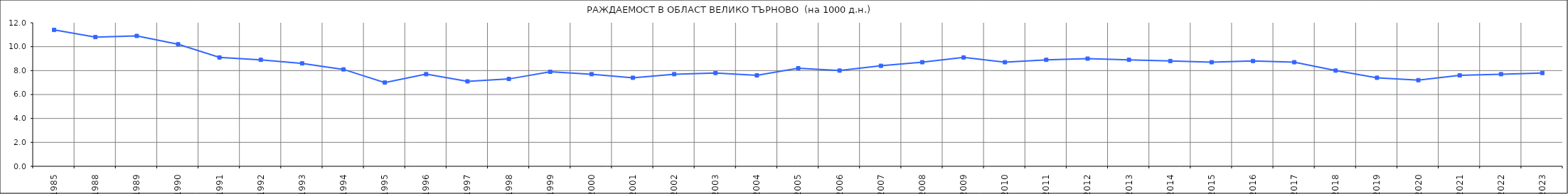
| Category | Series 0 | Series 1 |
|---|---|---|
| 1985.0 | 11.4 |  |
| 1988.0 | 10.8 |  |
| 1989.0 | 10.9 |  |
| 1990.0 | 10.2 |  |
| 1991.0 | 9.1 |  |
| 1992.0 | 8.9 |  |
| 1993.0 | 8.6 |  |
| 1994.0 | 8.1 |  |
| 1995.0 | 7 |  |
| 1996.0 | 7.7 |  |
| 1997.0 | 7.1 |  |
| 1998.0 | 7.3 |  |
| 1999.0 | 7.9 |  |
| 2000.0 | 7.7 |  |
| 2001.0 | 7.4 |  |
| 2002.0 | 7.7 |  |
| 2003.0 | 7.8 |  |
| 2004.0 | 7.6 |  |
| 2005.0 | 8.2 |  |
| 2006.0 | 8 |  |
| 2007.0 | 8.4 |  |
| 2008.0 | 8.7 |  |
| 2009.0 | 9.1 |  |
| 2010.0 | 8.7 |  |
| 2011.0 | 8.9 |  |
| 2012.0 | 9 |  |
| 2013.0 | 8.9 |  |
| 2014.0 | 8.8 |  |
| 2015.0 | 8.7 |  |
| 2016.0 | 8.8 |  |
| 2017.0 | 8.7 |  |
| 2018.0 | 8 |  |
| 2019.0 | 7.4 |  |
| 2020.0 | 7.2 |  |
| 2021.0 | 7.6 |  |
| 2022.0 | 7.7 |  |
| 2023.0 | 7.8 |  |